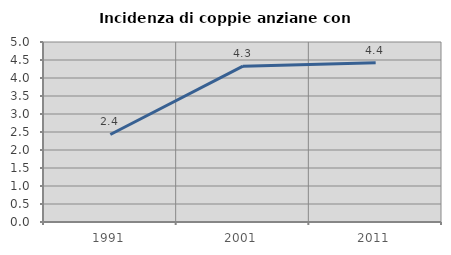
| Category | Incidenza di coppie anziane con figli |
|---|---|
| 1991.0 | 2.431 |
| 2001.0 | 4.328 |
| 2011.0 | 4.421 |